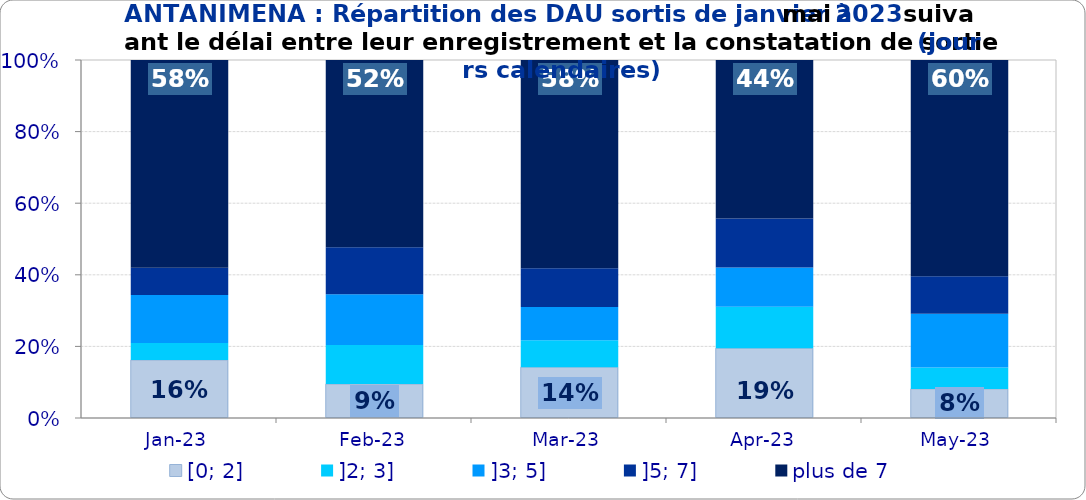
| Category | [0; 2] | ]2; 3] | ]3; 5] | ]5; 7] | plus de 7 |
|---|---|---|---|---|---|
| 2023-01-01 | 0.162 | 0.048 | 0.134 | 0.076 | 0.58 |
| 2023-02-01 | 0.095 | 0.109 | 0.142 | 0.131 | 0.523 |
| 2023-03-01 | 0.142 | 0.075 | 0.093 | 0.109 | 0.581 |
| 2023-04-01 | 0.195 | 0.116 | 0.109 | 0.137 | 0.442 |
| 2023-05-01 | 0.081 | 0.06 | 0.15 | 0.105 | 0.604 |